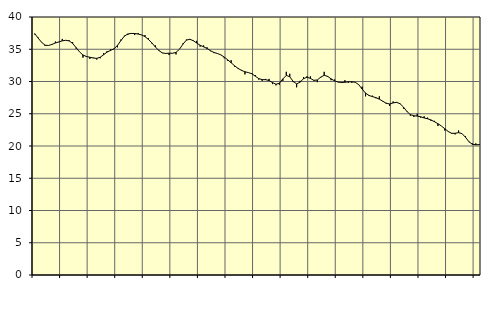
| Category | Piggar | Series 1 |
|---|---|---|
| nan | 37.3 | 37.42 |
| 87.0 | 36.8 | 36.73 |
| 87.0 | 36.1 | 36.07 |
| 87.0 | 35.5 | 35.63 |
| nan | 35.6 | 35.58 |
| 88.0 | 35.7 | 35.75 |
| 88.0 | 36.2 | 35.97 |
| 88.0 | 36.1 | 36.14 |
| nan | 36.6 | 36.3 |
| 89.0 | 36.4 | 36.39 |
| 89.0 | 36.4 | 36.29 |
| 89.0 | 36.1 | 35.9 |
| nan | 35.1 | 35.26 |
| 90.0 | 34.6 | 34.59 |
| 90.0 | 33.7 | 34.11 |
| 90.0 | 33.8 | 33.87 |
| nan | 33.5 | 33.76 |
| 91.0 | 33.7 | 33.64 |
| 91.0 | 33.4 | 33.59 |
| 91.0 | 33.6 | 33.76 |
| nan | 34.4 | 34.15 |
| 92.0 | 34.7 | 34.56 |
| 92.0 | 35 | 34.82 |
| 92.0 | 35 | 35.07 |
| nan | 35.3 | 35.58 |
| 93.0 | 36.5 | 36.34 |
| 93.0 | 37.1 | 37.02 |
| 93.0 | 37.2 | 37.37 |
| nan | 37.5 | 37.45 |
| 94.0 | 37.2 | 37.44 |
| 94.0 | 37.5 | 37.36 |
| 94.0 | 37.2 | 37.22 |
| nan | 37.2 | 36.96 |
| 95.0 | 36.7 | 36.52 |
| 95.0 | 35.9 | 35.98 |
| 95.0 | 35.6 | 35.36 |
| nan | 34.9 | 34.81 |
| 96.0 | 34.4 | 34.44 |
| 96.0 | 34.4 | 34.35 |
| 96.0 | 34.1 | 34.39 |
| nan | 34.4 | 34.38 |
| 97.0 | 34.2 | 34.51 |
| 97.0 | 35 | 35 |
| 97.0 | 35.9 | 35.78 |
| nan | 36.5 | 36.41 |
| 98.0 | 36.5 | 36.55 |
| 98.0 | 36.4 | 36.33 |
| 98.0 | 36.3 | 35.96 |
| nan | 35.4 | 35.62 |
| 99.0 | 35.6 | 35.38 |
| 99.0 | 35.3 | 35.12 |
| 99.0 | 34.7 | 34.78 |
| nan | 34.4 | 34.5 |
| 0.0 | 34.3 | 34.35 |
| 0.0 | 34.1 | 34.13 |
| 0.0 | 33.6 | 33.78 |
| nan | 33.2 | 33.36 |
| 1.0 | 33.3 | 32.9 |
| 1.0 | 32.3 | 32.44 |
| 1.0 | 32.1 | 32.03 |
| nan | 31.8 | 31.72 |
| 2.0 | 31.1 | 31.51 |
| 2.0 | 31.4 | 31.38 |
| 2.0 | 31.3 | 31.2 |
| nan | 31 | 30.83 |
| 3.0 | 30.3 | 30.45 |
| 3.0 | 30.1 | 30.29 |
| 3.0 | 30.4 | 30.28 |
| nan | 30.4 | 30.15 |
| 4.0 | 29.6 | 29.84 |
| 4.0 | 29.4 | 29.57 |
| 4.0 | 29.5 | 29.74 |
| nan | 30.1 | 30.4 |
| 5.0 | 31.5 | 30.94 |
| 5.0 | 31.2 | 30.74 |
| 5.0 | 29.9 | 30.02 |
| nan | 29.1 | 29.63 |
| 6.0 | 30.1 | 29.9 |
| 6.0 | 30.7 | 30.43 |
| 6.0 | 30.8 | 30.67 |
| nan | 30.8 | 30.48 |
| 7.0 | 30.1 | 30.18 |
| 7.0 | 29.9 | 30.24 |
| 7.0 | 30.6 | 30.68 |
| nan | 31.5 | 30.96 |
| 8.0 | 30.7 | 30.79 |
| 8.0 | 30.2 | 30.41 |
| 8.0 | 30.3 | 30.1 |
| nan | 29.9 | 29.92 |
| 9.0 | 29.9 | 29.84 |
| 9.0 | 30.2 | 29.88 |
| 9.0 | 29.8 | 29.95 |
| nan | 29.8 | 29.96 |
| 10.0 | 29.9 | 29.88 |
| 10.0 | 29.5 | 29.52 |
| 10.0 | 29.2 | 28.83 |
| nan | 27.7 | 28.2 |
| 11.0 | 27.9 | 27.83 |
| 11.0 | 27.8 | 27.66 |
| 11.0 | 27.4 | 27.5 |
| nan | 27.7 | 27.26 |
| 12.0 | 26.9 | 26.95 |
| 12.0 | 26.7 | 26.61 |
| 12.0 | 26.2 | 26.52 |
| nan | 26.9 | 26.68 |
| 13.0 | 26.7 | 26.77 |
| 13.0 | 26.6 | 26.56 |
| 13.0 | 25.8 | 26.04 |
| nan | 25.3 | 25.36 |
| 14.0 | 24.7 | 24.86 |
| 14.0 | 24.5 | 24.69 |
| 14.0 | 25 | 24.64 |
| nan | 24.4 | 24.53 |
| 15.0 | 24.6 | 24.35 |
| 15.0 | 24.4 | 24.22 |
| 15.0 | 23.9 | 24.04 |
| nan | 23.9 | 23.76 |
| 16.0 | 23.1 | 23.46 |
| 16.0 | 23.1 | 23.1 |
| 16.0 | 22.4 | 22.68 |
| nan | 22.2 | 22.24 |
| 17.0 | 21.9 | 21.97 |
| 17.0 | 21.8 | 21.97 |
| 17.0 | 22.4 | 22.07 |
| nan | 21.9 | 21.92 |
| 18.0 | 21.5 | 21.35 |
| 18.0 | 20.6 | 20.66 |
| 18.0 | 20.4 | 20.26 |
| nan | 20.4 | 20.19 |
| 19.0 | 20.3 | 20.21 |